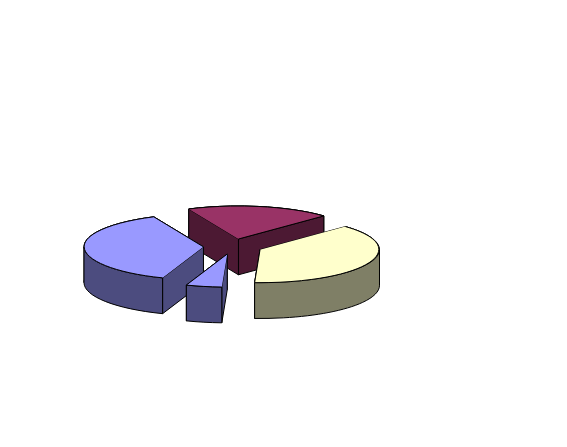
| Category | Series 0 |
|---|---|
| Servicios Personales | 280272953.4 |
| Gastos Generales | 145282999.293 |
| Contratos | 283500000 |
| Convenios | 36000000 |